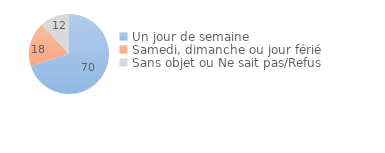
| Category | Series 0 |
|---|---|
| Un jour de semaine | 70.121 |
| Samedi, dimanche ou jour férié | 18.012 |
| Sans objet ou Ne sait pas/Refus | 11.866 |